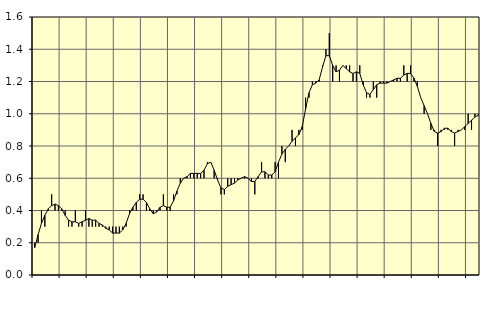
| Category | Piggar | Fast anställda utomlands |
|---|---|---|
| nan | 0.2 | 0.17 |
| 87.0 | 0.2 | 0.25 |
| 87.0 | 0.4 | 0.32 |
| 87.0 | 0.3 | 0.37 |
| nan | 0.4 | 0.41 |
| 88.0 | 0.5 | 0.43 |
| 88.0 | 0.4 | 0.44 |
| 88.0 | 0.4 | 0.43 |
| nan | 0.4 | 0.41 |
| 89.0 | 0.4 | 0.37 |
| 89.0 | 0.3 | 0.34 |
| 89.0 | 0.3 | 0.33 |
| nan | 0.4 | 0.33 |
| 90.0 | 0.3 | 0.32 |
| 90.0 | 0.3 | 0.33 |
| 90.0 | 0.4 | 0.34 |
| nan | 0.3 | 0.35 |
| 91.0 | 0.3 | 0.34 |
| 91.0 | 0.3 | 0.34 |
| 91.0 | 0.3 | 0.32 |
| nan | 0.3 | 0.31 |
| 92.0 | 0.3 | 0.29 |
| 92.0 | 0.3 | 0.28 |
| 92.0 | 0.3 | 0.26 |
| nan | 0.3 | 0.26 |
| 93.0 | 0.3 | 0.26 |
| 93.0 | 0.3 | 0.28 |
| 93.0 | 0.3 | 0.32 |
| nan | 0.4 | 0.38 |
| 94.0 | 0.4 | 0.42 |
| 94.0 | 0.4 | 0.45 |
| 94.0 | 0.5 | 0.47 |
| nan | 0.5 | 0.47 |
| 95.0 | 0.4 | 0.45 |
| 95.0 | 0.4 | 0.41 |
| 95.0 | 0.4 | 0.38 |
| nan | 0.4 | 0.39 |
| 96.0 | 0.4 | 0.42 |
| 96.0 | 0.5 | 0.43 |
| 96.0 | 0.4 | 0.42 |
| nan | 0.4 | 0.42 |
| 97.0 | 0.5 | 0.46 |
| 97.0 | 0.5 | 0.52 |
| 97.0 | 0.6 | 0.57 |
| nan | 0.6 | 0.6 |
| 98.0 | 0.6 | 0.61 |
| 98.0 | 0.6 | 0.63 |
| 98.0 | 0.6 | 0.63 |
| nan | 0.6 | 0.63 |
| 99.0 | 0.6 | 0.63 |
| 99.0 | 0.6 | 0.65 |
| 99.0 | 0.7 | 0.69 |
| nan | 0.7 | 0.7 |
| 0.0 | 0.6 | 0.65 |
| 0.0 | 0.6 | 0.59 |
| 0.0 | 0.5 | 0.54 |
| nan | 0.5 | 0.53 |
| 1.0 | 0.6 | 0.55 |
| 1.0 | 0.6 | 0.56 |
| 1.0 | 0.6 | 0.57 |
| nan | 0.6 | 0.59 |
| 2.0 | 0.6 | 0.6 |
| 2.0 | 0.6 | 0.61 |
| 2.0 | 0.6 | 0.6 |
| nan | 0.6 | 0.58 |
| 3.0 | 0.5 | 0.58 |
| 3.0 | 0.6 | 0.61 |
| 3.0 | 0.7 | 0.64 |
| nan | 0.6 | 0.64 |
| 4.0 | 0.6 | 0.62 |
| 4.0 | 0.6 | 0.62 |
| 4.0 | 0.7 | 0.64 |
| nan | 0.6 | 0.7 |
| 5.0 | 0.8 | 0.75 |
| 5.0 | 0.7 | 0.78 |
| 5.0 | 0.8 | 0.8 |
| nan | 0.9 | 0.83 |
| 6.0 | 0.8 | 0.85 |
| 6.0 | 0.9 | 0.87 |
| 6.0 | 0.9 | 0.92 |
| nan | 1.1 | 1.03 |
| 7.0 | 1.1 | 1.13 |
| 7.0 | 1.2 | 1.18 |
| 7.0 | 1.2 | 1.19 |
| nan | 1.2 | 1.21 |
| 8.0 | 1.3 | 1.29 |
| 8.0 | 1.4 | 1.36 |
| 8.0 | 1.5 | 1.36 |
| nan | 1.2 | 1.3 |
| 9.0 | 1.3 | 1.26 |
| 9.0 | 1.2 | 1.27 |
| 9.0 | 1.3 | 1.3 |
| nan | 1.3 | 1.28 |
| 10.0 | 1.3 | 1.26 |
| 10.0 | 1.2 | 1.25 |
| 10.0 | 1.2 | 1.26 |
| nan | 1.3 | 1.25 |
| 11.0 | 1.2 | 1.18 |
| 11.0 | 1.1 | 1.13 |
| 11.0 | 1.1 | 1.12 |
| nan | 1.2 | 1.15 |
| 12.0 | 1.1 | 1.18 |
| 12.0 | 1.2 | 1.19 |
| 12.0 | 1.2 | 1.19 |
| nan | 1.2 | 1.19 |
| 13.0 | 1.2 | 1.2 |
| 13.0 | 1.2 | 1.21 |
| 13.0 | 1.2 | 1.22 |
| nan | 1.2 | 1.22 |
| 14.0 | 1.3 | 1.24 |
| 14.0 | 1.2 | 1.25 |
| 14.0 | 1.3 | 1.25 |
| nan | 1.2 | 1.22 |
| 15.0 | 1.2 | 1.17 |
| 15.0 | 1.1 | 1.1 |
| 15.0 | 1 | 1.05 |
| nan | 1 | 1 |
| 16.0 | 0.9 | 0.94 |
| 16.0 | 0.9 | 0.89 |
| 16.0 | 0.8 | 0.88 |
| nan | 0.9 | 0.89 |
| 17.0 | 0.9 | 0.91 |
| 17.0 | 0.9 | 0.91 |
| 17.0 | 0.9 | 0.89 |
| nan | 0.8 | 0.88 |
| 18.0 | 0.9 | 0.89 |
| 18.0 | 0.9 | 0.9 |
| 18.0 | 0.9 | 0.92 |
| nan | 1 | 0.94 |
| 19.0 | 0.9 | 0.96 |
| 19.0 | 1 | 0.98 |
| 19.0 | 1 | 0.99 |